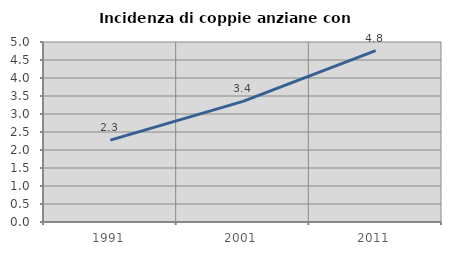
| Category | Incidenza di coppie anziane con figli |
|---|---|
| 1991.0 | 2.273 |
| 2001.0 | 3.352 |
| 2011.0 | 4.762 |